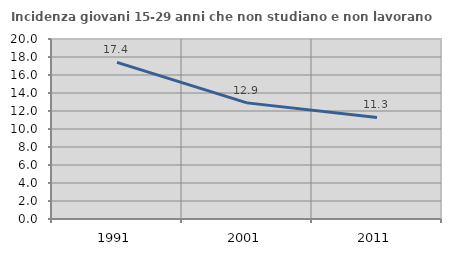
| Category | Incidenza giovani 15-29 anni che non studiano e non lavorano  |
|---|---|
| 1991.0 | 17.397 |
| 2001.0 | 12.903 |
| 2011.0 | 11.278 |